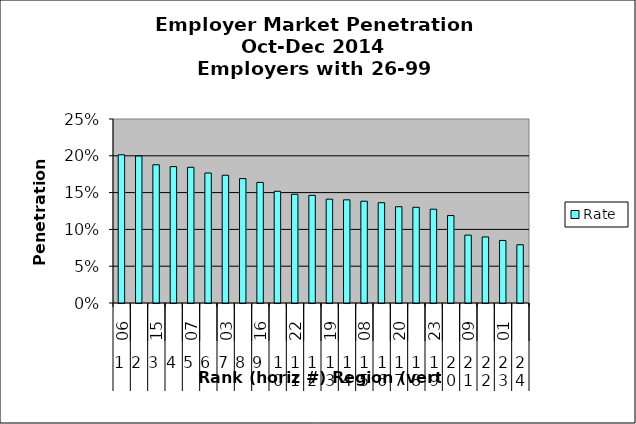
| Category | Rate |
|---|---|
| 0 | 0.201 |
| 1 | 0.2 |
| 2 | 0.188 |
| 3 | 0.185 |
| 4 | 0.184 |
| 5 | 0.177 |
| 6 | 0.174 |
| 7 | 0.169 |
| 8 | 0.164 |
| 9 | 0.152 |
| 10 | 0.148 |
| 11 | 0.146 |
| 12 | 0.141 |
| 13 | 0.14 |
| 14 | 0.138 |
| 15 | 0.136 |
| 16 | 0.131 |
| 17 | 0.13 |
| 18 | 0.127 |
| 19 | 0.119 |
| 20 | 0.092 |
| 21 | 0.09 |
| 22 | 0.085 |
| 23 | 0.079 |